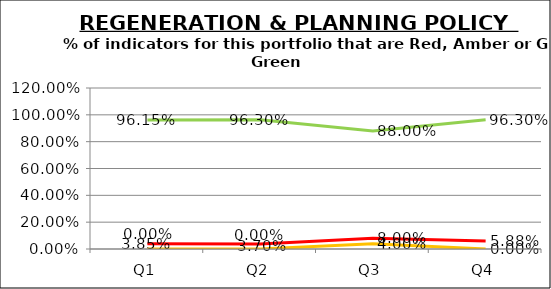
| Category | Green | Amber | Red |
|---|---|---|---|
| Q1 | 0.962 | 0 | 0.038 |
| Q2 | 0.963 | 0 | 0.037 |
| Q3 | 0.88 | 0.04 | 0.08 |
| Q4 | 0.963 | 0 | 0.059 |